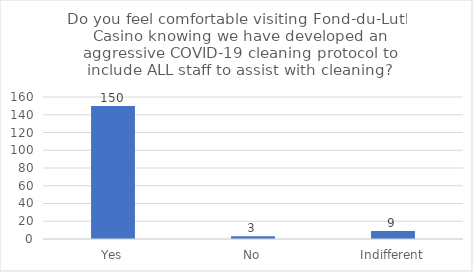
| Category | Series 0 |
|---|---|
| Yes | 150 |
| No | 3 |
| Indifferent | 9 |